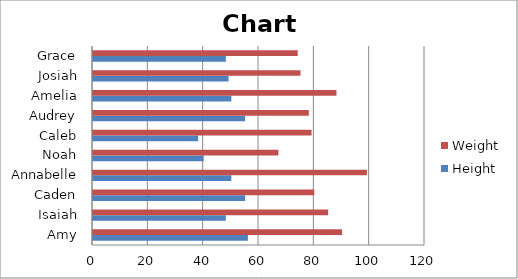
| Category | Height | Weight |
|---|---|---|
| Amy | 56 | 90 |
| Isaiah | 48 | 85 |
| Caden | 55 | 80 |
| Annabelle | 50 | 99 |
| Noah | 40 | 67 |
| Caleb | 38 | 79 |
| Audrey | 55 | 78 |
| Amelia | 50 | 88 |
| Josiah | 49 | 75 |
| Grace | 48 | 74 |